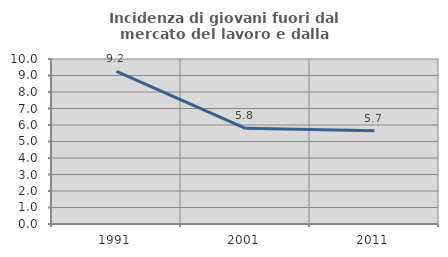
| Category | Incidenza di giovani fuori dal mercato del lavoro e dalla formazione  |
|---|---|
| 1991.0 | 9.244 |
| 2001.0 | 5.801 |
| 2011.0 | 5.656 |